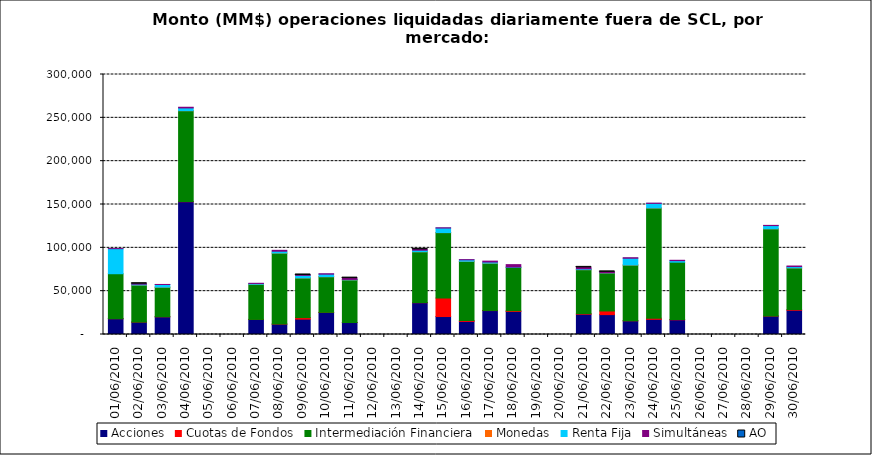
| Category | Acciones | Cuotas de Fondos | Intermediación Financiera | Monedas | Renta Fija | Simultáneas | AO |
|---|---|---|---|---|---|---|---|
| 01/06/2010 | 18230.983 | 25.692 | 51862.79 | 0 | 28924.319 | 73.566 | 0 |
| 02/06/2010 | 14333.296 | 13.007 | 42727.577 | 6.57 | 971.441 | 549.894 | 0.011 |
| 03/06/2010 | 20424.247 | 80.046 | 34128.822 | 4.015 | 3047.952 | 64.591 | 0 |
| 04/06/2010 | 153218.198 | 125.962 | 104891.119 | 8.76 | 3193.215 | 776.356 | 0 |
| 07/06/2010 | 17380.922 | 16.25 | 40548.307 | 3.65 | 947.016 | 164.374 | 0 |
| 08/06/2010 | 11988.85 | 0.866 | 82007.471 | 4.969 | 2092.354 | 1022.644 | 0 |
| 09/06/2010 | 17729.299 | 1756.76 | 45784.225 | 2.61 | 2973.616 | 433.526 | 0.024 |
| 10/06/2010 | 25397.02 | 157.099 | 41135.722 | 14.239 | 2905.663 | 486.492 | 0 |
| 11/06/2010 | 13807.518 | 55.074 | 49154.092 | 0.548 | 528.684 | 1491.659 | 0.091 |
| 14/06/2010 | 36699.249 | 159.828 | 58623.338 | 7.693 | 1774.474 | 988.515 | 0.298 |
| 15/06/2010 | 20732.612 | 21281.483 | 75562.39 | 3.75 | 5270.22 | 278.526 | 0 |
| 16/06/2010 | 15126.818 | 1043.459 | 68294.808 | 29.693 | 1671.743 | 200.737 | 0 |
| 17/06/2010 | 27602.736 | 145.844 | 54585.352 | 9.579 | 1267.521 | 1053.023 | 0 |
| 18/06/2010 | 26563.341 | 862.922 | 50033.246 | 0 | 350.756 | 2824.481 | 0 |
| 21/06/2010 | 23394.847 | 663.318 | 50764.431 | 3.801 | 948.202 | 1676.047 | 0.272 |
| 22/06/2010 | 22945.891 | 4222.958 | 43910.982 | 8.085 | 247.3 | 912.829 | 0.306 |
| 23/06/2010 | 15835.508 | 23.94 | 64296.234 | 33.505 | 7804.469 | 597.287 | 0 |
| 24/06/2010 | 17516.71 | 1268.778 | 127228.468 | 3.275 | 5258.71 | 284.804 | 0 |
| 25/06/2010 | 16948.651 | 271.202 | 66253.783 | 0 | 1727.178 | 432.223 | 0 |
| 29/06/2010 | 21248.049 | 10.658 | 100708.154 | 0.39 | 3691.304 | 246.852 | 0 |
| 30/06/2010 | 27981.291 | 794.571 | 48104.515 | 10.92 | 1479.141 | 640.238 | 0 |